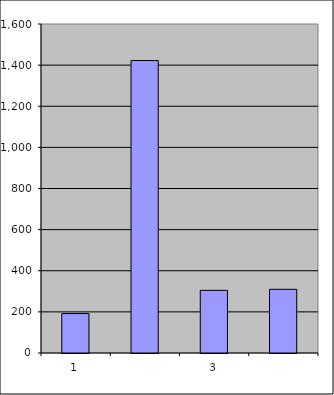
| Category | Series 0 |
|---|---|
| 0 | 191.75 |
| 1 | 1422.282 |
| 2 | 304.663 |
| 3 | 309.722 |